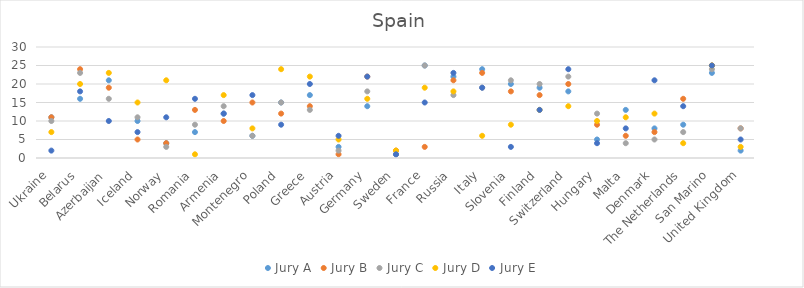
| Category | Jury A | Jury B | Jury C | Jury D | Jury E |
|---|---|---|---|---|---|
| Ukraine | 11 | 11 | 10 | 7 | 2 |
| Belarus | 16 | 24 | 23 | 20 | 18 |
| Azerbaijan | 21 | 19 | 16 | 23 | 10 |
| Iceland | 10 | 5 | 11 | 15 | 7 |
| Norway | 4 | 4 | 3 | 21 | 11 |
| Romania | 7 | 13 | 9 | 1 | 16 |
| Armenia | 12 | 10 | 14 | 17 | 12 |
| Montenegro | 6 | 15 | 6 | 8 | 17 |
| Poland | 15 | 12 | 15 | 24 | 9 |
| Greece | 17 | 14 | 13 | 22 | 20 |
| Austria | 3 | 1 | 2 | 5 | 6 |
| Germany | 14 | 22 | 18 | 16 | 22 |
| Sweden | 1 | 2 | 1 | 2 | 1 |
| France | 25 | 3 | 25 | 19 | 15 |
| Russia | 22 | 21 | 17 | 18 | 23 |
| Italy | 24 | 23 | 19 | 6 | 19 |
| Slovenia | 20 | 18 | 21 | 9 | 3 |
| Finland | 19 | 17 | 20 | 13 | 13 |
| Switzerland | 18 | 20 | 22 | 14 | 24 |
| Hungary | 5 | 9 | 12 | 10 | 4 |
| Malta | 13 | 6 | 4 | 11 | 8 |
| Denmark | 8 | 7 | 5 | 12 | 21 |
| The Netherlands | 9 | 16 | 7 | 4 | 14 |
| San Marino | 23 | 25 | 24 | 25 | 25 |
| United Kingdom | 2 | 8 | 8 | 3 | 5 |